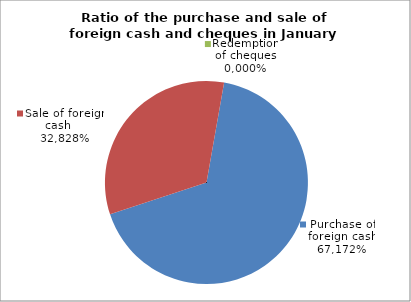
| Category | Purchase of foreign cash |
|---|---|
| 0 | 0.672 |
| 1 | 0.328 |
| 2 | 0 |